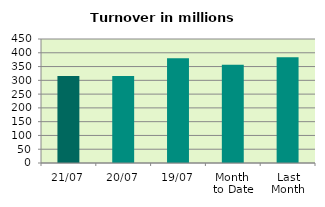
| Category | Series 0 |
|---|---|
| 21/07 | 316.153 |
| 20/07 | 315.926 |
| 19/07 | 380.361 |
| Month 
to Date | 356.328 |
| Last
Month | 384.158 |